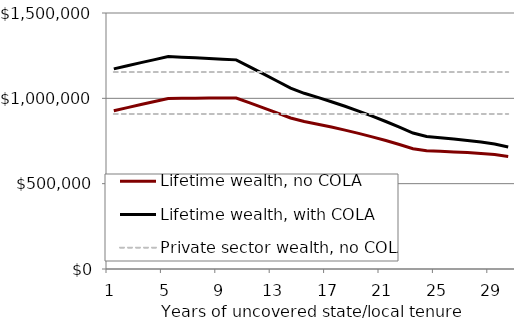
| Category | Lifetime wealth, no COLA | Lifetime wealth, with COLA | Private sector wealth, no COLA | Private sector wealth, with COLA |
|---|---|---|---|---|
| 1.0 | 927125.021 | 1172646.223 | 908533.677 | 1154054.879 |
| 2.0 | 945451.53 | 1190972.732 | 908533.677 | 1154054.879 |
| 3.0 | 963516.978 | 1209038.18 | 908533.677 | 1154054.879 |
| 4.0 | 981325.084 | 1226846.286 | 908533.677 | 1154054.879 |
| 5.0 | 998879.513 | 1244400.715 | 908533.677 | 1154054.879 |
| 6.0 | 999942.487 | 1241074.633 | 908533.677 | 1154054.879 |
| 7.0 | 1000758.961 | 1237502.05 | 908533.677 | 1154054.879 |
| 8.0 | 1001332.446 | 1233686.478 | 908533.677 | 1154054.879 |
| 9.0 | 1001666.402 | 1229631.377 | 908533.677 | 1154054.879 |
| 10.0 | 1001764.242 | 1225340.16 | 908533.677 | 1154054.879 |
| 11.0 | 972864.308 | 1184277.74 | 908533.677 | 1154054.879 |
| 12.0 | 943734.937 | 1142985.883 | 908533.677 | 1154054.879 |
| 13.0 | 914379.397 | 1101467.857 | 908533.677 | 1154054.879 |
| 14.0 | 884800.911 | 1059726.884 | 908533.677 | 1154054.879 |
| 15.0 | 864296.99 | 1029572.169 | 908533.677 | 1154054.879 |
| 16.0 | 848625.415 | 1005614.232 | 908533.677 | 1154054.879 |
| 17.0 | 831838.499 | 980297.256 | 908533.677 | 1154054.879 |
| 18.0 | 813891.573 | 953563.68 | 908533.677 | 1154054.879 |
| 19.0 | 794737.602 | 925352.945 | 908533.677 | 1154054.879 |
| 20.0 | 774327.074 | 895601.363 | 908533.677 | 1154054.879 |
| 21.0 | 752607.894 | 864241.972 | 908533.677 | 1154054.879 |
| 22.0 | 729525.262 | 831204.387 | 908533.677 | 1154054.879 |
| 23.0 | 705021.553 | 796414.644 | 908533.677 | 1154054.879 |
| 24.0 | 692490.854 | 776885.681 | 908533.677 | 1154054.879 |
| 25.0 | 689424.94 | 769430.711 | 908533.677 | 1154054.879 |
| 26.0 | 686171.341 | 761788.055 | 908533.677 | 1154054.879 |
| 27.0 | 682115.558 | 753176.432 | 908533.677 | 1154054.879 |
| 28.0 | 677236.774 | 743568.685 | 908533.677 | 1154054.879 |
| 29.0 | 670806.285 | 732038.485 | 908533.677 | 1154054.879 |
| 30.0 | 659501.7 | 714364.909 | 908533.677 | 1154054.879 |